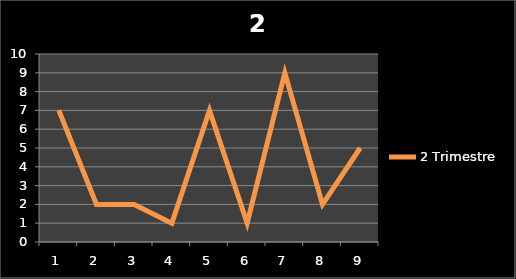
| Category | 2 Trimestre |
|---|---|
| 0 | 7 |
| 1 | 2 |
| 2 | 2 |
| 3 | 1 |
| 4 | 7 |
| 5 | 1 |
| 6 | 9 |
| 7 | 2 |
| 8 | 5 |